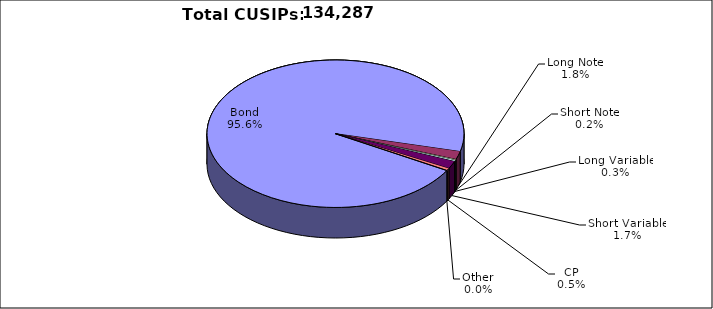
| Category | CUSIPs |
|---|---|
| Bond | 128322 |
| Long Note | 2384 |
| Short Note | 278 |
| Long Variable | 359 |
| Short Variable | 2239 |
| CP | 646 |
| Other | 59 |